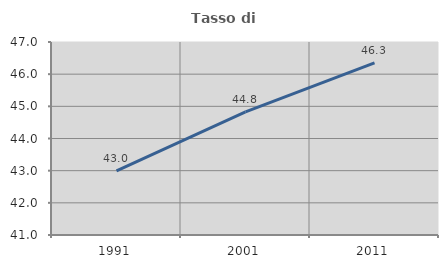
| Category | Tasso di occupazione   |
|---|---|
| 1991.0 | 42.997 |
| 2001.0 | 44.828 |
| 2011.0 | 46.348 |